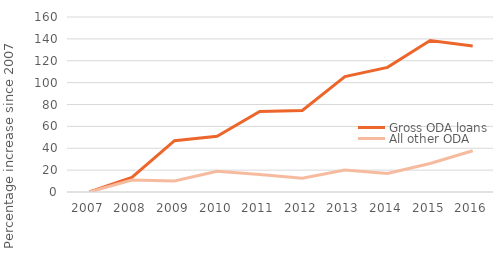
| Category | Gross ODA loans | All other ODA |
|---|---|---|
| 2007.0 | 0 | 0 |
| 2008.0 | 13.389 | 10.891 |
| 2009.0 | 46.946 | 10.164 |
| 2010.0 | 51.03 | 18.908 |
| 2011.0 | 73.63 | 15.924 |
| 2012.0 | 74.563 | 12.673 |
| 2013.0 | 105.522 | 20.047 |
| 2014.0 | 113.96 | 16.866 |
| 2015.0 | 138.521 | 26.06 |
| 2016.0 | 133.552 | 37.722 |